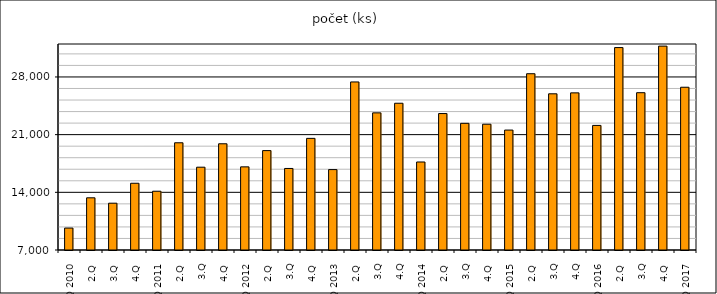
| Category | počet (ks) |
|---|---|
| 1.Q 2010 | 9662 |
| 2.Q  | 13334 |
| 3.Q  | 12680 |
| 4.Q  | 15099 |
| 1.Q 2011 | 14133 |
| 2.Q  | 20013 |
| 3.Q | 17050 |
| 4.Q  | 19892 |
| 1.Q 2012 | 17090 |
| 2.Q  | 19062 |
| 3.Q | 16895 |
| 4.Q  | 20548 |
| 1.Q 2013 | 16759 |
| 2.Q  | 27395 |
| 3.Q | 23643 |
| 4.Q | 24811 |
| 1.Q 2014 | 17680 |
| 2.Q  | 23559 |
| 3.Q | 22374 |
| 4.Q  | 22265 |
| 1.Q 2015 | 21554 |
| 2.Q  | 28393 |
| 3.Q | 25956 |
| 4.Q | 26070 |
| 1.Q 2016 | 22119 |
| 2.Q  | 31566 |
| 3.Q | 26090 |
| 4.Q  | 31745 |
| 1.Q 2017 | 26752 |